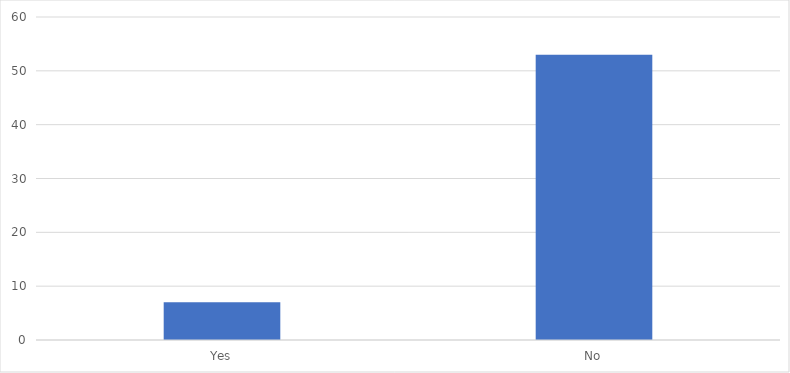
| Category | Number of Responses |
|---|---|
| Yes | 7 |
| No | 53 |